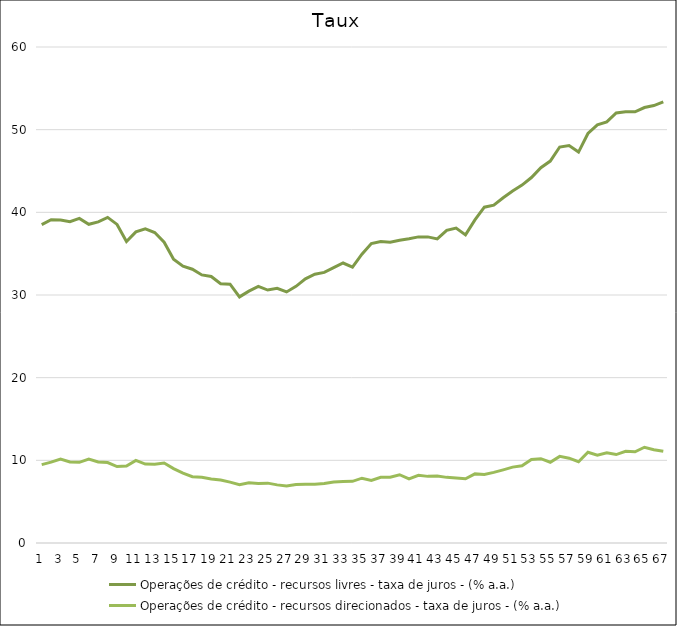
| Category | Operações de crédito - recursos livres - taxa de juros - (% a.a.) | Operações de crédito - recursos direcionados - taxa de juros - (% a.a.) |
|---|---|---|
| 0 | 38.51 | 9.48 |
| 1 | 39.1 | 9.78 |
| 2 | 39.06 | 10.15 |
| 3 | 38.86 | 9.81 |
| 4 | 39.26 | 9.76 |
| 5 | 38.55 | 10.14 |
| 6 | 38.85 | 9.81 |
| 7 | 39.39 | 9.73 |
| 8 | 38.54 | 9.25 |
| 9 | 36.48 | 9.3 |
| 10 | 37.64 | 9.99 |
| 11 | 38.01 | 9.55 |
| 12 | 37.56 | 9.52 |
| 13 | 36.39 | 9.68 |
| 14 | 34.32 | 9 |
| 15 | 33.49 | 8.45 |
| 16 | 33.12 | 8.02 |
| 17 | 32.43 | 7.94 |
| 18 | 32.24 | 7.75 |
| 19 | 31.37 | 7.62 |
| 20 | 31.31 | 7.36 |
| 21 | 29.77 | 7.06 |
| 22 | 30.47 | 7.29 |
| 23 | 31.04 | 7.2 |
| 24 | 30.6 | 7.24 |
| 25 | 30.81 | 7.03 |
| 26 | 30.37 | 6.91 |
| 27 | 31.05 | 7.08 |
| 28 | 31.95 | 7.12 |
| 29 | 32.51 | 7.11 |
| 30 | 32.74 | 7.2 |
| 31 | 33.32 | 7.39 |
| 32 | 33.87 | 7.45 |
| 33 | 33.36 | 7.46 |
| 34 | 34.94 | 7.84 |
| 35 | 36.22 | 7.57 |
| 36 | 36.48 | 7.94 |
| 37 | 36.39 | 7.96 |
| 38 | 36.63 | 8.26 |
| 39 | 36.81 | 7.76 |
| 40 | 37.03 | 8.18 |
| 41 | 37.03 | 8.06 |
| 42 | 36.79 | 8.1 |
| 43 | 37.82 | 7.94 |
| 44 | 38.09 | 7.87 |
| 45 | 37.27 | 7.77 |
| 46 | 39.09 | 8.36 |
| 47 | 40.62 | 8.28 |
| 48 | 40.86 | 8.54 |
| 49 | 41.76 | 8.85 |
| 50 | 42.57 | 9.18 |
| 51 | 43.29 | 9.34 |
| 52 | 44.21 | 10.1 |
| 53 | 45.4 | 10.2 |
| 54 | 46.2 | 9.77 |
| 55 | 47.9 | 10.48 |
| 56 | 48.09 | 10.26 |
| 57 | 47.29 | 9.83 |
| 58 | 49.54 | 10.98 |
| 59 | 50.58 | 10.63 |
| 60 | 50.95 | 10.91 |
| 61 | 52.02 | 10.7 |
| 62 | 52.17 | 11.09 |
| 63 | 52.16 | 11.03 |
| 64 | 52.68 | 11.58 |
| 65 | 52.92 | 11.29 |
| 66 | 53.37 | 11.1 |